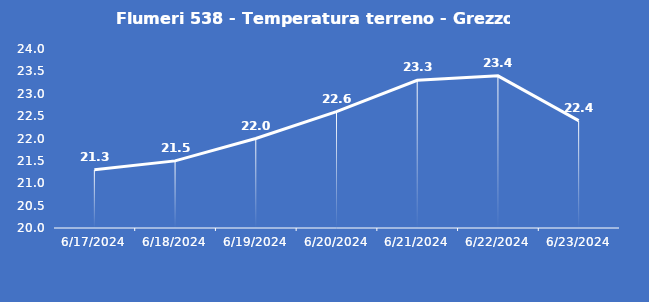
| Category | Flumeri 538 - Temperatura terreno - Grezzo (°C) |
|---|---|
| 6/17/24 | 21.3 |
| 6/18/24 | 21.5 |
| 6/19/24 | 22 |
| 6/20/24 | 22.6 |
| 6/21/24 | 23.3 |
| 6/22/24 | 23.4 |
| 6/23/24 | 22.4 |